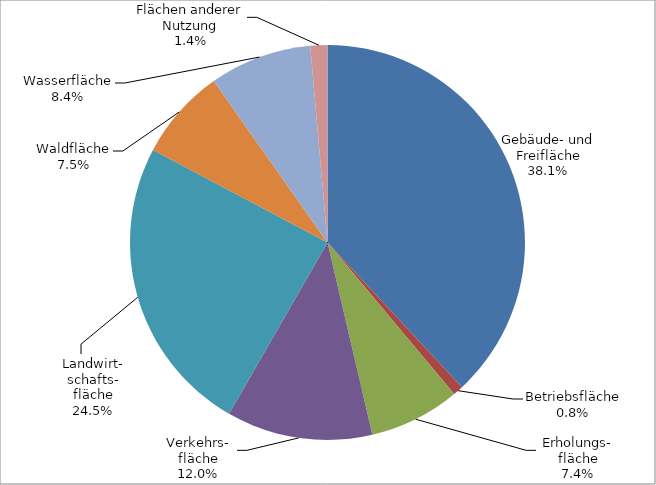
| Category | 2015 |
|---|---|
| Gebäude- und Freifläche | 28761.812 |
| Betriebsfläche | 632.956 |
| Erholungs-
fläche | 5607.349 |
| Verkehrs-
fläche | 9029.722 |
| Landwirt-
schafts-
fläche | 18463.061 |
| Waldfläche | 5642.724 |
| Wasserfläche | 6328.585 |
| Flächen anderer Nutzung | 1053.74 |